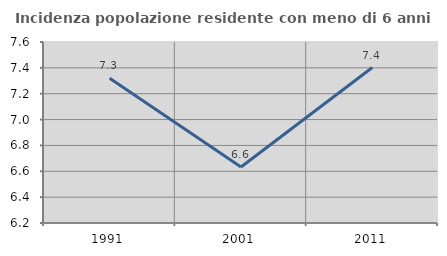
| Category | Incidenza popolazione residente con meno di 6 anni |
|---|---|
| 1991.0 | 7.319 |
| 2001.0 | 6.633 |
| 2011.0 | 7.403 |